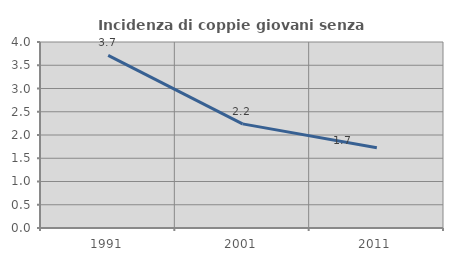
| Category | Incidenza di coppie giovani senza figli |
|---|---|
| 1991.0 | 3.712 |
| 2001.0 | 2.239 |
| 2011.0 | 1.724 |